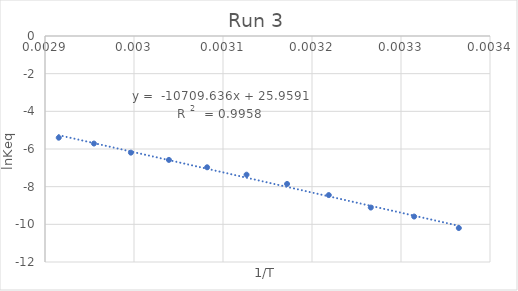
| Category | Series 0 |
|---|---|
| 0.003364963994885255 | -10.197 |
| 0.003314770617873243 | -9.586 |
| 0.0032660526487686982 | -9.109 |
| 0.0032188495831589788 | -8.446 |
| 0.003171985028230667 | -7.856 |
| 0.0031264655307175235 | -7.364 |
| 0.0030821390044691015 | -6.971 |
| 0.0030392365437802026 | -6.579 |
| 0.002996524032122737 | -6.194 |
| 0.002954995419757099 | -5.71 |
| 0.0029154518950437317 | -5.4 |